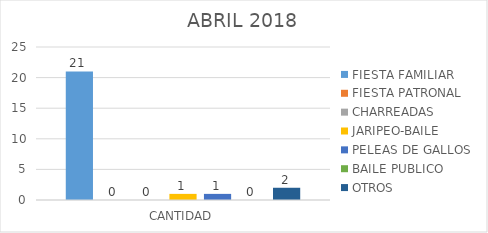
| Category | FIESTA FAMILIAR | FIESTA PATRONAL | CHARREADAS | JARIPEO-BAILE | PELEAS DE GALLOS | BAILE PUBLICO | OTROS |
|---|---|---|---|---|---|---|---|
| CANTIDAD | 21 | 0 | 0 | 1 | 1 | 0 | 2 |